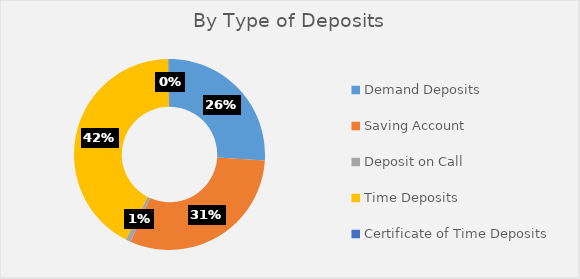
| Category | B. Type of Deposits  |
|---|---|
| Demand Deposits  | 1738.612 |
| Saving Account  | 2054.847 |
| Deposit on Call  | 58.353 |
| Time Deposits  | 2828.228 |
| Certificate of Time Deposits  | 11.464 |